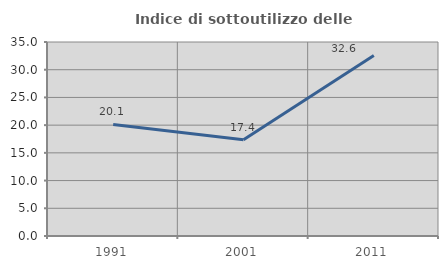
| Category | Indice di sottoutilizzo delle abitazioni  |
|---|---|
| 1991.0 | 20.13 |
| 2001.0 | 17.355 |
| 2011.0 | 32.558 |